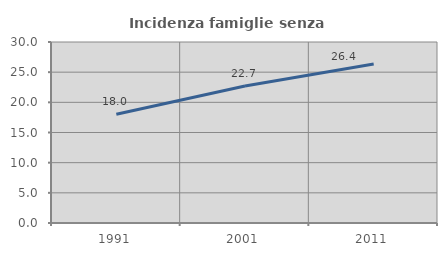
| Category | Incidenza famiglie senza nuclei |
|---|---|
| 1991.0 | 18.012 |
| 2001.0 | 22.715 |
| 2011.0 | 26.366 |